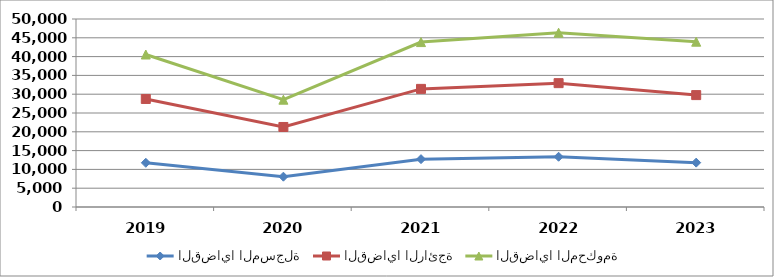
| Category | القضايا المسجلة | القضايا الرائجة | القضايا المحكومة |
|---|---|---|---|
| 2019.0 | 11757 | 16977 | 11822 |
| 2020.0 | 8064 | 13219 | 7255 |
| 2021.0 | 12725 | 18689 | 12447 |
| 2022.0 | 13363 | 19576 | 13414 |
| 2023.0 | 11799 | 17961 | 14205 |